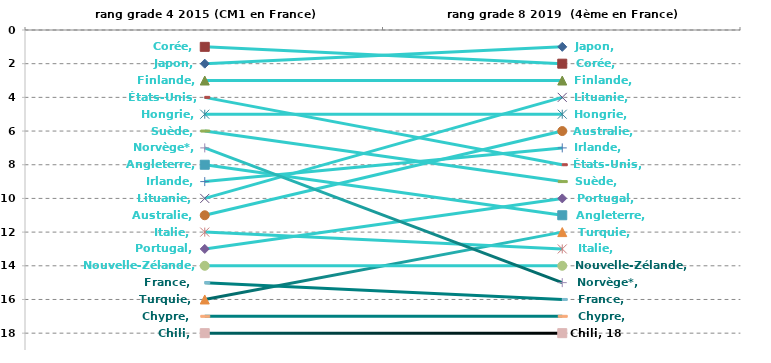
| Category | Japon | Corée | Finlande | Lituanie | Hongrie | Australie | Irlande | États-Unis | Suède | Portugal | Angleterre | Turquie | Italie | Nouvelle-Zélande | Norvège* | France | Chypre | Chili |
|---|---|---|---|---|---|---|---|---|---|---|---|---|---|---|---|---|---|---|
| rang grade 4 2015 (CM1 en France) | 2 | 1 | 3 | 10 | 5 | 11 | 9 | 4 | 6 | 13 | 8 | 16 | 12 | 14 | 7 | 15 | 17 | 18 |
| rang grade 8 2019  (4ème en France) | 1 | 2 | 3 | 4 | 5 | 6 | 7 | 8 | 9 | 10 | 11 | 12 | 13 | 14 | 15 | 16 | 17 | 18 |